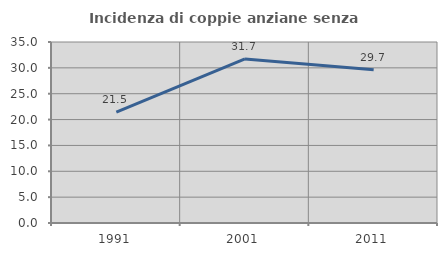
| Category | Incidenza di coppie anziane senza figli  |
|---|---|
| 1991.0 | 21.453 |
| 2001.0 | 31.731 |
| 2011.0 | 29.655 |